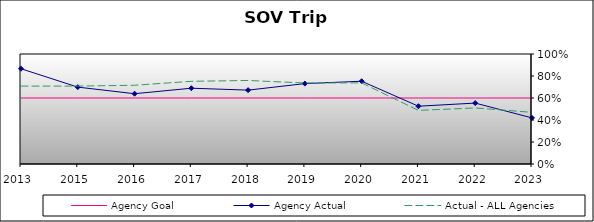
| Category | Agency Goal | Agency Actual | Actual - ALL Agencies |
|---|---|---|---|
| 2013.0 | 0.6 | 0.866 | 0.708 |
| 2015.0 | 0.6 | 0.699 | 0.708 |
| 2016.0 | 0.6 | 0.639 | 0.716 |
| 2017.0 | 0.6 | 0.689 | 0.752 |
| 2018.0 | 0.6 | 0.672 | 0.759 |
| 2019.0 | 0.6 | 0.731 | 0.736 |
| 2020.0 | 0.6 | 0.753 | 0.737 |
| 2021.0 | 0.6 | 0.525 | 0.487 |
| 2022.0 | 0.6 | 0.554 | 0.509 |
| 2023.0 | 0.6 | 0.419 | 0.47 |